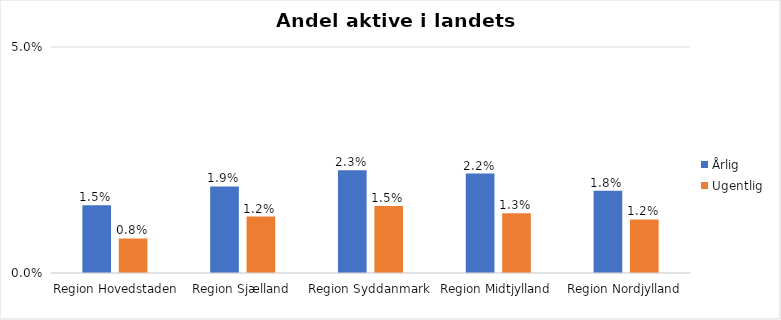
| Category | Årlig | Ugentlig |
|---|---|---|
| Region Hovedstaden | 0.015 | 0.008 |
| Region Sjælland | 0.019 | 0.012 |
| Region Syddanmark | 0.023 | 0.015 |
| Region Midtjylland | 0.022 | 0.013 |
| Region Nordjylland | 0.018 | 0.012 |